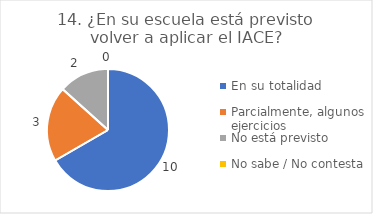
| Category | 14. ¿En su escuela está previsto volver a aplicar el IACE? |
|---|---|
| En su totalidad  | 0.667 |
| Parcialmente, algunos ejercicios  | 0.2 |
| No está previsto  | 0.133 |
| No sabe / No contesta | 0 |